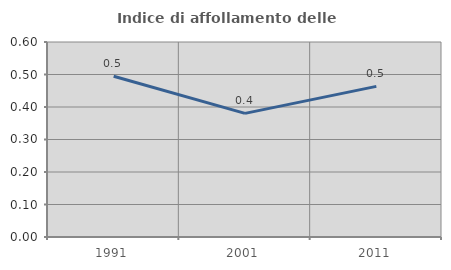
| Category | Indice di affollamento delle abitazioni  |
|---|---|
| 1991.0 | 0.495 |
| 2001.0 | 0.38 |
| 2011.0 | 0.463 |